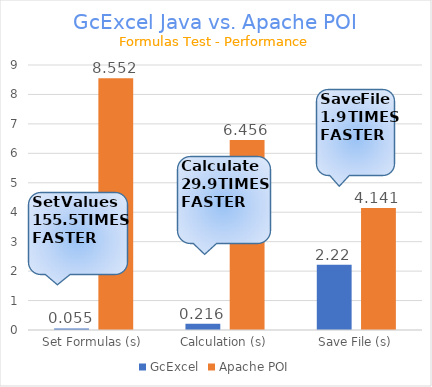
| Category | GcExcel | Apache POI |
|---|---|---|
| Set Formulas (s) | 0.055 | 8.552 |
| Calculation (s) | 0.216 | 6.456 |
| Save File (s) | 2.22 | 4.141 |